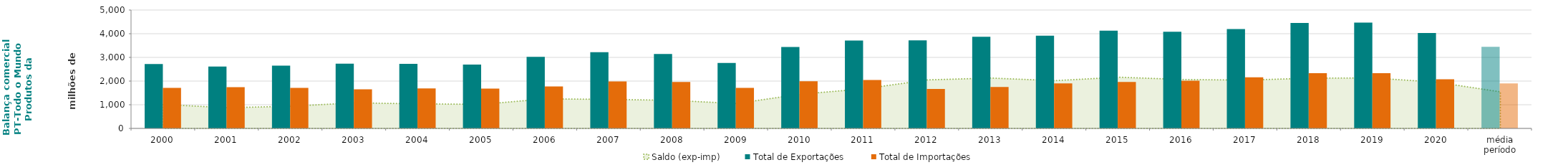
| Category | Total de Exportações  | Total de Importações  |
|---|---|---|
| 2000 | 2719.364 | 1711.327 |
| 2001 | 2613.741 | 1739.129 |
| 2002 | 2651.317 | 1715.256 |
| 2003 | 2732.206 | 1651.964 |
| 2004 | 2729.619 | 1692.418 |
| 2005 | 2700.567 | 1683.361 |
| 2006 | 3023.368 | 1775.717 |
| 2007 | 3216.917 | 1988.444 |
| 2008 | 3143.269 | 1959.202 |
| 2009 | 2761.887 | 1710.724 |
| 2010 | 3437.789 | 1992.856 |
| 2011 | 3715.67 | 2045.075 |
| 2012 | 3718.236 | 1668.747 |
| 2013 | 3874.977 | 1747.165 |
| 2014 | 3915.819 | 1898.536 |
| 2015 | 4127.679 | 1964.291 |
| 2016 | 4080.574 | 2013.498 |
| 2017 | 4197.892 | 2159.026 |
| 2018 | 4453.026 | 2330.485 |
| 2019 | 4467.779 | 2336.95 |
| 2020 | 4027.565 | 2076.223 |
| média período | 3443.298 | 1898.114 |